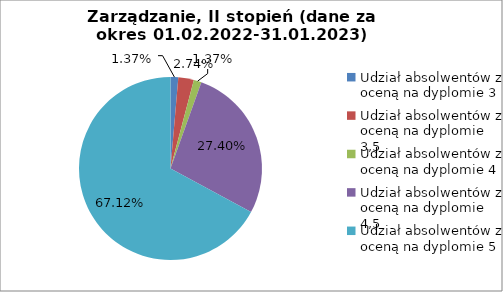
| Category | Series 0 |
|---|---|
| Udział absolwentów z oceną na dyplomie 3 | 1.37 |
| Udział absolwentów z oceną na dyplomie 3,5 | 2.74 |
| Udział absolwentów z oceną na dyplomie 4 | 1.37 |
| Udział absolwentów z oceną na dyplomie 4,5 | 27.397 |
| Udział absolwentów z oceną na dyplomie 5 | 67.123 |